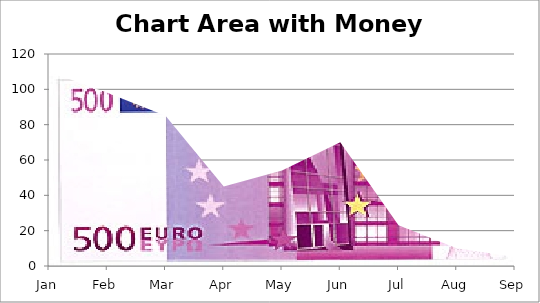
| Category | Value |
|---|---|
| Jan | 110 |
| Feb | 98 |
| Mar | 85 |
| Apr | 45 |
| May | 54 |
| Jun | 70 |
| Jul | 23 |
| Aug | 10 |
| Sep | 5 |